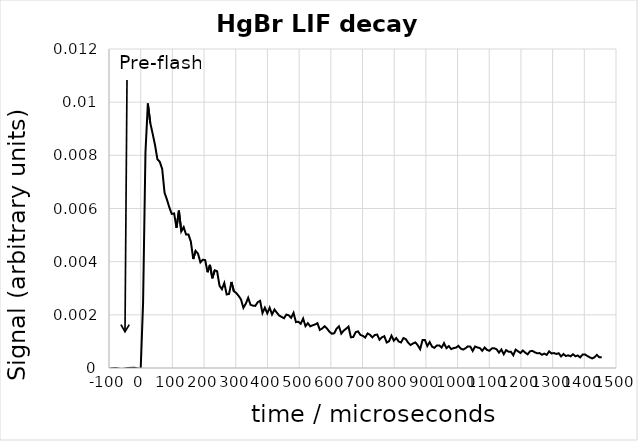
| Category | Series 0 |
|---|---|
| -100.0 | 0 |
| -80.0 | 0 |
| -60.0 | 0 |
| -40.0 | 0 |
| -20.0 | 0 |
| 0.0 | 0 |
| 7.538 | 0.002 |
| 15.075 | 0.008 |
| 22.613001 | 0.01 |
| 30.150999 | 0.009 |
| 37.688 | 0.009 |
| 45.226002 | 0.008 |
| 52.764 | 0.008 |
| 60.301998 | 0.008 |
| 67.838997 | 0.007 |
| 75.376999 | 0.007 |
| 82.915001 | 0.006 |
| 90.452003 | 0.006 |
| 97.989998 | 0.006 |
| 105.528 | 0.006 |
| 113.065002 | 0.005 |
| 120.602997 | 0.006 |
| 128.141006 | 0.005 |
| 135.677994 | 0.005 |
| 143.216003 | 0.005 |
| 150.753998 | 0.005 |
| 158.291 | 0.005 |
| 165.828995 | 0.004 |
| 173.367004 | 0.004 |
| 180.904999 | 0.004 |
| 188.442001 | 0.004 |
| 195.979996 | 0.004 |
| 203.518005 | 0.004 |
| 211.054993 | 0.004 |
| 218.593002 | 0.004 |
| 226.130997 | 0.003 |
| 233.667999 | 0.004 |
| 241.205994 | 0.004 |
| 248.744003 | 0.003 |
| 256.281006 | 0.003 |
| 263.819 | 0.003 |
| 271.356995 | 0.003 |
| 278.894012 | 0.003 |
| 286.432007 | 0.003 |
| 293.970001 | 0.003 |
| 301.507996 | 0.003 |
| 309.045013 | 0.003 |
| 316.583008 | 0.003 |
| 324.121002 | 0.002 |
| 331.65799 | 0.002 |
| 339.196014 | 0.003 |
| 346.734009 | 0.002 |
| 354.270996 | 0.002 |
| 361.80899 | 0.002 |
| 369.346985 | 0.002 |
| 376.884003 | 0.003 |
| 384.421997 | 0.002 |
| 391.959991 | 0.002 |
| 399.497009 | 0.002 |
| 407.035004 | 0.002 |
| 414.572998 | 0.002 |
| 422.110992 | 0.002 |
| 429.64801 | 0.002 |
| 437.186005 | 0.002 |
| 444.723999 | 0.002 |
| 452.260986 | 0.002 |
| 459.799011 | 0.002 |
| 467.337006 | 0.002 |
| 474.873993 | 0.002 |
| 482.411987 | 0.002 |
| 489.950012 | 0.002 |
| 497.487 | 0.002 |
| 505.024994 | 0.002 |
| 512.562988 | 0.002 |
| 520.101013 | 0.002 |
| 527.638 | 0.002 |
| 535.176025 | 0.002 |
| 542.713989 | 0.002 |
| 550.250977 | 0.002 |
| 557.789001 | 0.002 |
| 565.327026 | 0.001 |
| 572.864014 | 0.001 |
| 580.401978 | 0.002 |
| 587.940002 | 0.001 |
| 595.47699 | 0.001 |
| 603.015015 | 0.001 |
| 610.552979 | 0.001 |
| 618.090027 | 0.001 |
| 625.627991 | 0.002 |
| 633.166016 | 0.001 |
| 640.703979 | 0.001 |
| 648.241028 | 0.001 |
| 655.778992 | 0.002 |
| 663.317017 | 0.001 |
| 670.854004 | 0.001 |
| 678.392029 | 0.001 |
| 685.929993 | 0.001 |
| 693.46698 | 0.001 |
| 701.005005 | 0.001 |
| 708.54303 | 0.001 |
| 716.080017 | 0.001 |
| 723.617981 | 0.001 |
| 731.156006 | 0.001 |
| 738.692993 | 0.001 |
| 746.231018 | 0.001 |
| 753.768982 | 0.001 |
| 761.307007 | 0.001 |
| 768.843994 | 0.001 |
| 776.382019 | 0.001 |
| 783.919983 | 0.001 |
| 791.45697 | 0.001 |
| 798.994995 | 0.001 |
| 806.53302 | 0.001 |
| 814.070007 | 0.001 |
| 821.607971 | 0.001 |
| 829.145996 | 0.001 |
| 836.682983 | 0.001 |
| 844.221008 | 0.001 |
| 851.758972 | 0.001 |
| 859.296021 | 0.001 |
| 866.833984 | 0.001 |
| 874.372009 | 0.001 |
| 881.909973 | 0.001 |
| 889.447021 | 0.001 |
| 896.984985 | 0.001 |
| 904.52301 | 0.001 |
| 912.059998 | 0.001 |
| 919.598022 | 0.001 |
| 927.135986 | 0.001 |
| 934.672974 | 0.001 |
| 942.210999 | 0.001 |
| 949.749023 | 0.001 |
| 957.286011 | 0.001 |
| 964.823975 | 0.001 |
| 972.362 | 0.001 |
| 979.898987 | 0.001 |
| 987.437012 | 0.001 |
| 994.974976 | 0.001 |
| 1002.513 | 0.001 |
| 1010.049988 | 0.001 |
| 1017.588013 | 0.001 |
| 1025.125977 | 0.001 |
| 1032.662964 | 0.001 |
| 1040.20105 | 0.001 |
| 1047.739014 | 0.001 |
| 1055.276001 | 0.001 |
| 1062.813965 | 0.001 |
| 1070.352051 | 0.001 |
| 1077.889038 | 0.001 |
| 1085.427002 | 0.001 |
| 1092.964966 | 0.001 |
| 1100.503052 | 0.001 |
| 1108.040039 | 0.001 |
| 1115.578003 | 0.001 |
| 1123.115967 | 0.001 |
| 1130.652954 | 0.001 |
| 1138.19104 | 0.001 |
| 1145.729004 | 0.001 |
| 1153.265991 | 0.001 |
| 1160.803955 | 0.001 |
| 1168.342041 | 0.001 |
| 1175.879028 | 0 |
| 1183.416992 | 0.001 |
| 1190.954956 | 0.001 |
| 1198.491943 | 0.001 |
| 1206.030029 | 0.001 |
| 1213.567993 | 0.001 |
| 1221.105957 | 0.001 |
| 1228.642944 | 0.001 |
| 1236.18103 | 0.001 |
| 1243.718994 | 0.001 |
| 1251.255981 | 0.001 |
| 1258.793945 | 0.001 |
| 1266.332031 | 0 |
| 1273.869019 | 0.001 |
| 1281.406982 | 0 |
| 1288.944946 | 0.001 |
| 1296.482056 | 0.001 |
| 1304.02002 | 0.001 |
| 1311.557983 | 0.001 |
| 1319.094971 | 0.001 |
| 1326.633057 | 0 |
| 1334.171021 | 0.001 |
| 1341.708984 | 0 |
| 1349.245972 | 0 |
| 1356.784058 | 0 |
| 1364.322021 | 0.001 |
| 1371.859009 | 0 |
| 1379.396973 | 0 |
| 1386.935059 | 0 |
| 1394.472046 | 0.001 |
| 1402.01001 | 0.001 |
| 1409.547974 | 0 |
| 1417.084961 | 0 |
| 1424.623047 | 0 |
| 1432.161011 | 0 |
| 1439.697998 | 0 |
| 1447.235962 | 0 |
| 1454.774048 | 0 |